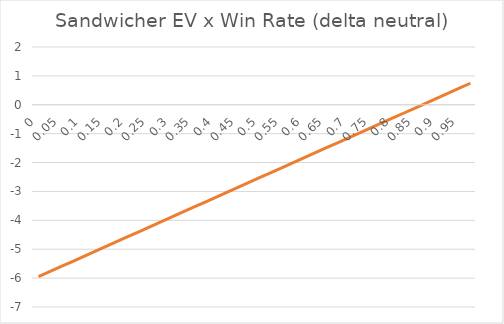
| Category | (dRate/dVlm) |
|---|---|
| 0.0 | -5.95 |
| 0.025 | -5.778 |
| 0.05 | -5.606 |
| 0.07500000000000001 | -5.435 |
| 0.1 | -5.263 |
| 0.125 | -5.091 |
| 0.15 | -4.92 |
| 0.175 | -4.748 |
| 0.19999999999999998 | -4.576 |
| 0.22499999999999998 | -4.405 |
| 0.24999999999999997 | -4.233 |
| 0.27499999999999997 | -4.061 |
| 0.3 | -3.89 |
| 0.325 | -3.718 |
| 0.35000000000000003 | -3.546 |
| 0.37500000000000006 | -3.375 |
| 0.4000000000000001 | -3.203 |
| 0.4250000000000001 | -3.031 |
| 0.4500000000000001 | -2.86 |
| 0.47500000000000014 | -2.688 |
| 0.5000000000000001 | -2.516 |
| 0.5250000000000001 | -2.345 |
| 0.5500000000000002 | -2.173 |
| 0.5750000000000002 | -2.001 |
| 0.6000000000000002 | -1.83 |
| 0.6250000000000002 | -1.658 |
| 0.6500000000000002 | -1.486 |
| 0.6750000000000003 | -1.315 |
| 0.7000000000000003 | -1.143 |
| 0.7250000000000003 | -0.971 |
| 0.7500000000000003 | -0.8 |
| 0.7750000000000004 | -0.628 |
| 0.8000000000000004 | -0.456 |
| 0.8250000000000004 | -0.285 |
| 0.8500000000000004 | -0.113 |
| 0.8750000000000004 | 0.059 |
| 0.9000000000000005 | 0.23 |
| 0.9250000000000005 | 0.402 |
| 0.9500000000000005 | 0.574 |
| 0.9750000000000005 | 0.745 |